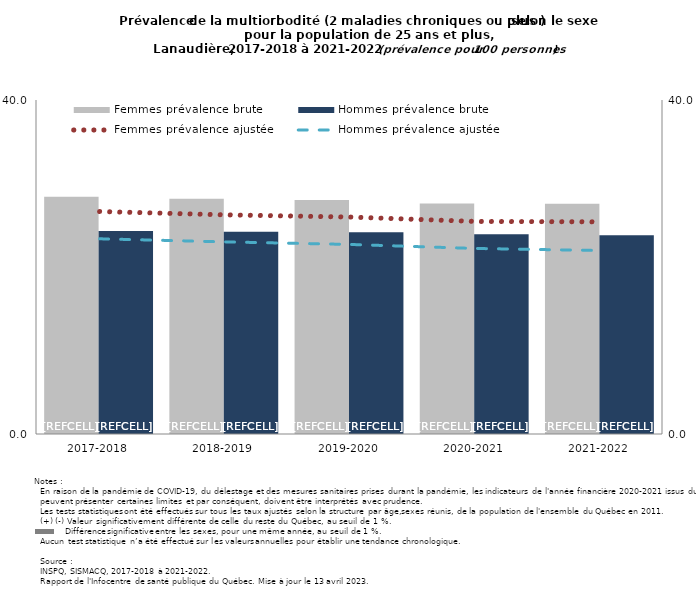
| Category | Femmes prévalence brute | Hommes prévalence brute |
|---|---|---|
| 2017-2018 | 28.408 | 24.32 |
| 2018-2019 | 28.179 | 24.233 |
| 2019-2020 | 28.026 | 24.171 |
| 2020-2021 | 27.594 | 23.927 |
| 2021-2022 | 27.586 | 23.812 |